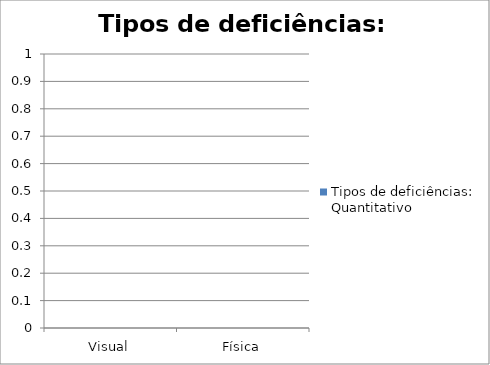
| Category | Tipos de deficiências: Quantitativo |
|---|---|
| Visual | 0 |
| Física | 0 |